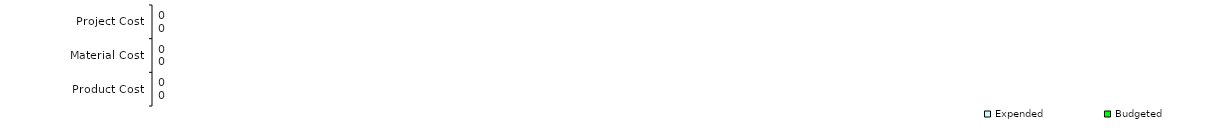
| Category | Budgeted | Expended |
|---|---|---|
| Product Cost | 0 | 0 |
| Material Cost | 0 | 0 |
| Project Cost | 0 | 0 |